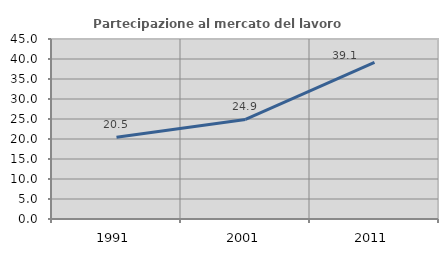
| Category | Partecipazione al mercato del lavoro  femminile |
|---|---|
| 1991.0 | 20.455 |
| 2001.0 | 24.88 |
| 2011.0 | 39.13 |